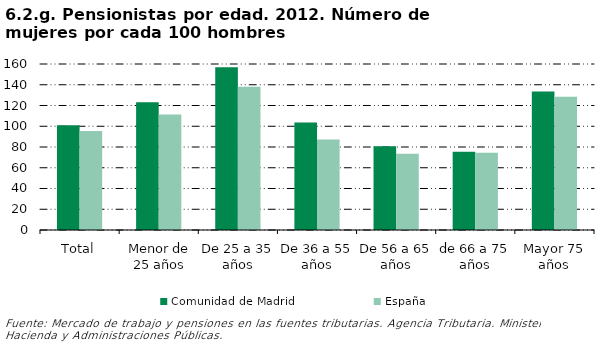
| Category | Comunidad de Madrid | España |
|---|---|---|
| Total | 101.067 | 95.497 |
| Menor de 25 años | 123.106 | 111.347 |
| De 25 a 35 años | 156.972 | 138.022 |
| De 36 a 55 años | 103.534 | 87.149 |
| De 56 a 65 años | 80.684 | 73.482 |
| de 66 a 75 años | 75.495 | 74.492 |
| Mayor 75 años | 133.4 | 128.369 |